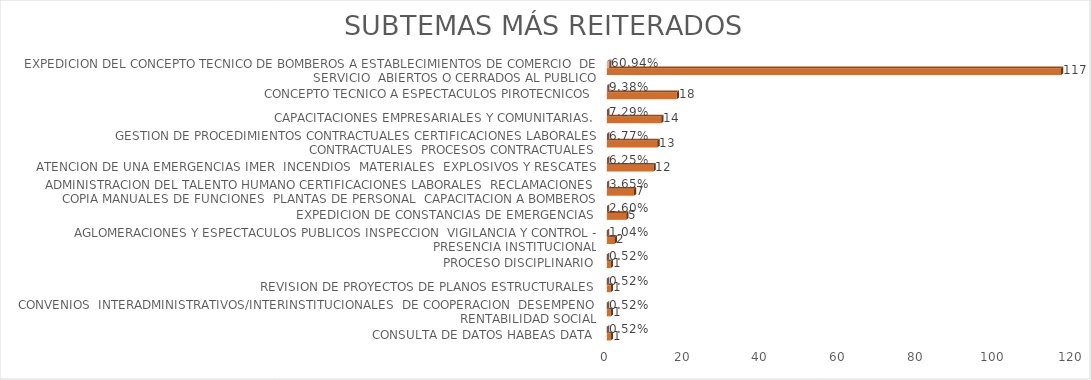
| Category | Cuenta de Número petición | Cuenta de Número petición2 |
|---|---|---|
| CONSULTA DE DATOS HABEAS DATA | 1 | 0.005 |
| CONVENIOS  INTERADMINISTRATIVOS/INTERINSTITUCIONALES  DE COOPERACION  DESEMPENO  RENTABILIDAD SOCIAL | 1 | 0.005 |
| REVISION DE PROYECTOS DE PLANOS ESTRUCTURALES | 1 | 0.005 |
| PROCESO DISCIPLINARIO | 1 | 0.005 |
| AGLOMERACIONES Y ESPECTACULOS PUBLICOS INSPECCION  VIGILANCIA Y CONTROL - PRESENCIA INSTITUCIONAL | 2 | 0.01 |
| EXPEDICION DE CONSTANCIAS DE EMERGENCIAS | 5 | 0.026 |
| ADMINISTRACION DEL TALENTO HUMANO CERTIFICACIONES LABORALES  RECLAMACIONES  COPIA MANUALES DE FUNCIONES  PLANTAS DE PERSONAL  CAPACITACION A BOMBEROS | 7 | 0.036 |
| ATENCION DE UNA EMERGENCIAS IMER  INCENDIOS  MATERIALES  EXPLOSIVOS Y RESCATES | 12 | 0.062 |
| GESTION DE PROCEDIMIENTOS CONTRACTUALES CERTIFICACIONES LABORALES CONTRACTUALES  PROCESOS CONTRACTUALES | 13 | 0.068 |
| CAPACITACIONES EMPRESARIALES Y COMUNITARIAS. | 14 | 0.073 |
| CONCEPTO TECNICO A ESPECTACULOS PIROTECNICOS | 18 | 0.094 |
| EXPEDICION DEL CONCEPTO TECNICO DE BOMBEROS A ESTABLECIMIENTOS DE COMERCIO  DE SERVICIO  ABIERTOS O CERRADOS AL PUBLICO | 117 | 0.609 |